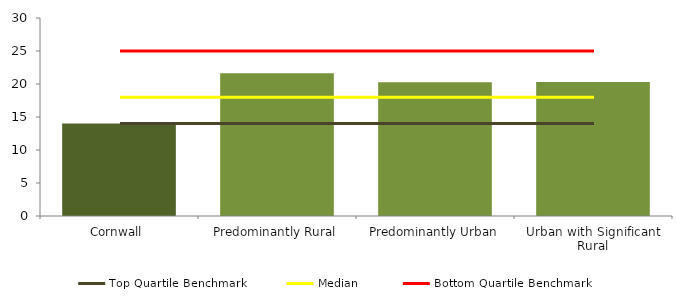
| Category | Series 0 |
|---|---|
| Cornwall | 14 |
| Predominantly Rural | 21.636 |
| Predominantly Urban | 20.25 |
| Urban with Significant Rural | 20.3 |